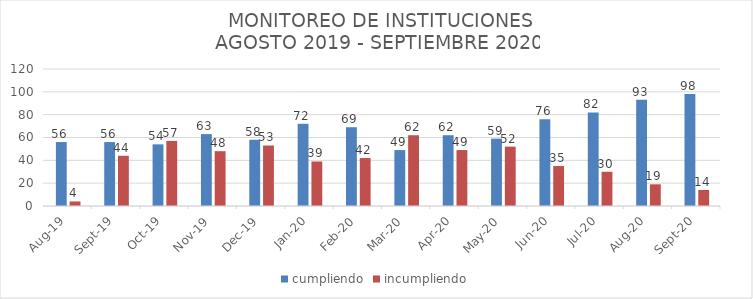
| Category | cumpliendo | incumpliendo |
|---|---|---|
| 2019-08-01 | 56 | 4 |
| 2019-09-01 | 56 | 44 |
| 2019-10-01 | 54 | 57 |
| 2019-11-01 | 63 | 48 |
| 2019-12-01 | 58 | 53 |
| 2020-01-01 | 72 | 39 |
| 2020-02-01 | 69 | 42 |
| 2020-03-01 | 49 | 62 |
| 2020-04-01 | 62 | 49 |
| 2020-05-01 | 59 | 52 |
| 2020-06-01 | 76 | 35 |
| 2020-07-01 | 82 | 30 |
| 2020-08-01 | 93 | 19 |
| 2020-09-01 | 98 | 14 |